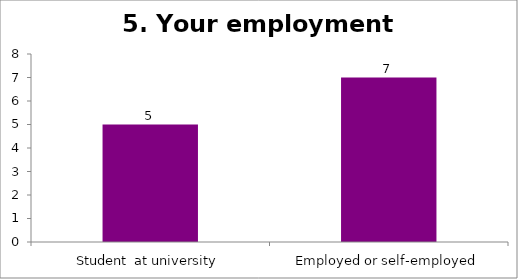
| Category | 5. Your employment status |
|---|---|
| Student  at university | 5 |
| Employed or self-employed | 7 |